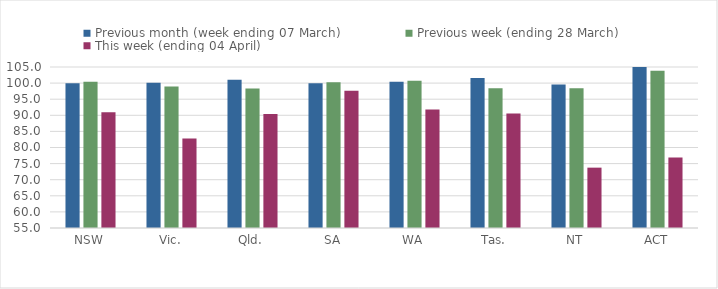
| Category | Previous month (week ending 07 March) | Previous week (ending 28 March) | This week (ending 04 April) |
|---|---|---|---|
| NSW | 99.925 | 100.45 | 90.97 |
| Vic. | 100.082 | 98.931 | 82.812 |
| Qld. | 101.025 | 98.354 | 90.432 |
| SA | 99.943 | 100.286 | 97.597 |
| WA | 100.452 | 100.72 | 91.829 |
| Tas. | 101.579 | 98.421 | 90.526 |
| NT | 99.543 | 98.402 | 73.744 |
| ACT | 107.692 | 103.846 | 76.923 |